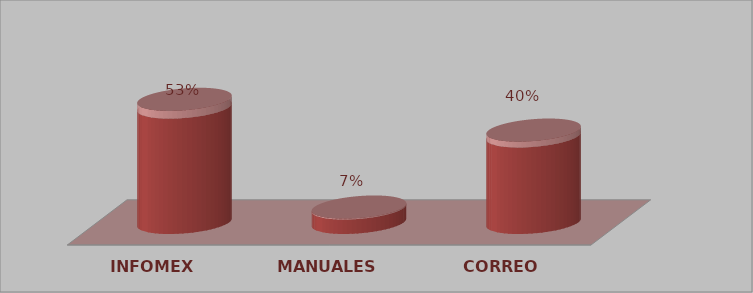
| Category | Series 0 | Series 1 |
|---|---|---|
| INFOMEX | 8 | 0.533 |
| MANUALES | 1 | 0.067 |
| CORREO | 6 | 0.4 |